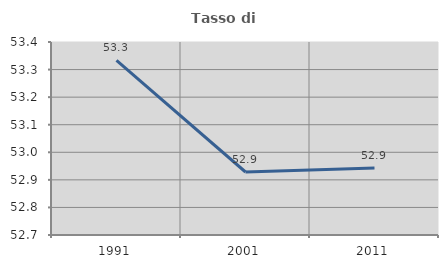
| Category | Tasso di occupazione   |
|---|---|
| 1991.0 | 53.333 |
| 2001.0 | 52.928 |
| 2011.0 | 52.943 |